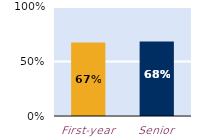
| Category | frequently |
|---|---|
| First-year | 0.674 |
| Senior | 0.684 |